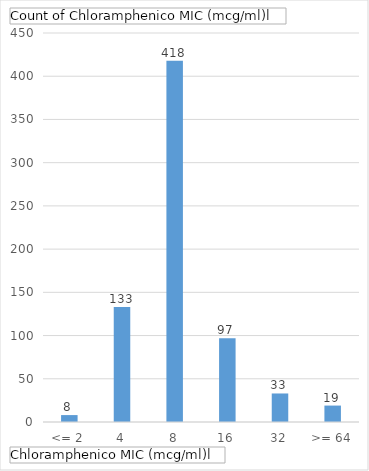
| Category | Total |
|---|---|
| <= 2 | 8 |
| 4 | 133 |
| 8 | 418 |
| 16 | 97 |
| 32 | 33 |
| >= 64 | 19 |